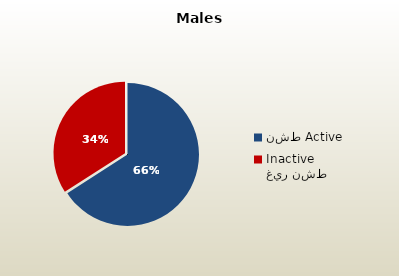
| Category | الذكور القطريين  Qatari Males |
|---|---|
| نشط Active | 71109 |
| غير نشط Inactive | 36777 |